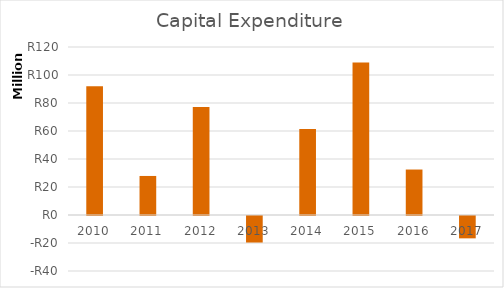
| Category | Capital Expenditure |
|---|---|
| 2010.0 | 91907522 |
| 2011.0 | 27882387 |
| 2012.0 | 77143941 |
| 2013.0 | -18943000 |
| 2014.0 | 61503043 |
| 2015.0 | 108925750 |
| 2016.0 | 32478033 |
| 2017.0 | -15963239 |